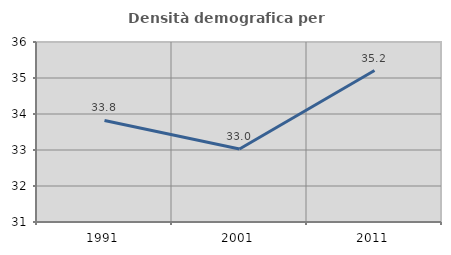
| Category | Densità demografica |
|---|---|
| 1991.0 | 33.821 |
| 2001.0 | 33.029 |
| 2011.0 | 35.208 |